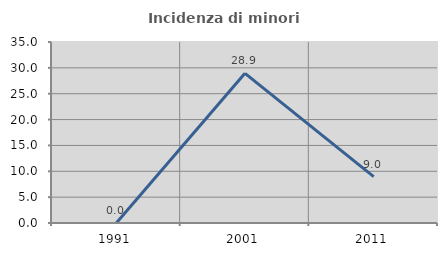
| Category | Incidenza di minori stranieri |
|---|---|
| 1991.0 | 0 |
| 2001.0 | 28.947 |
| 2011.0 | 8.974 |